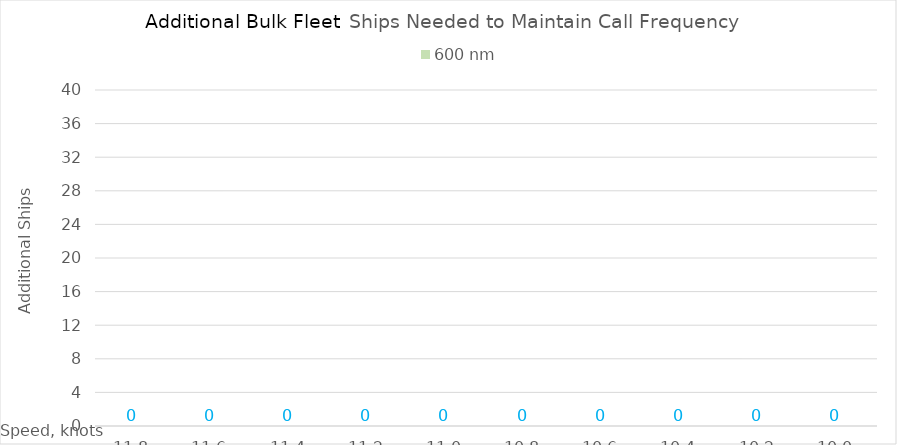
| Category | 600 |
|---|---|
| 11.8 | 0 |
| 11.600000000000001 | 0 |
| 11.400000000000002 | 0 |
| 11.200000000000003 | 0 |
| 11.000000000000004 | 0 |
| 10.800000000000004 | 0 |
| 10.600000000000005 | 0 |
| 10.400000000000006 | 0 |
| 10.200000000000006 | 0 |
| 10.000000000000007 | 0 |